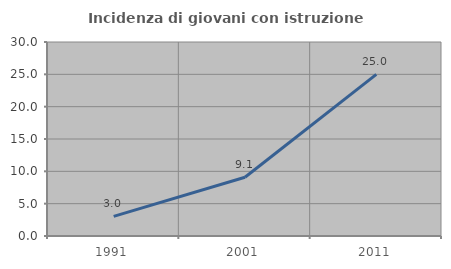
| Category | Incidenza di giovani con istruzione universitaria |
|---|---|
| 1991.0 | 3.03 |
| 2001.0 | 9.091 |
| 2011.0 | 25 |